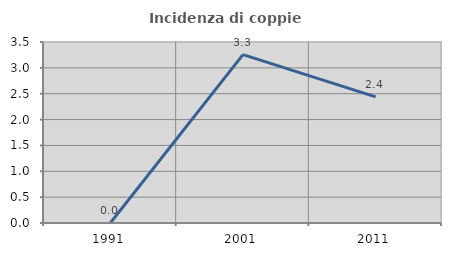
| Category | Incidenza di coppie miste |
|---|---|
| 1991.0 | 0 |
| 2001.0 | 3.256 |
| 2011.0 | 2.439 |